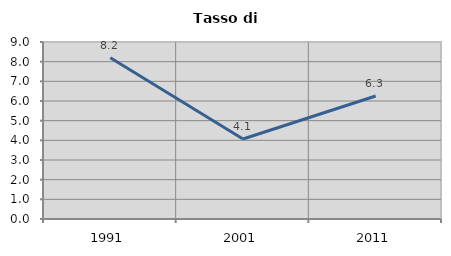
| Category | Tasso di disoccupazione   |
|---|---|
| 1991.0 | 8.196 |
| 2001.0 | 4.067 |
| 2011.0 | 6.254 |